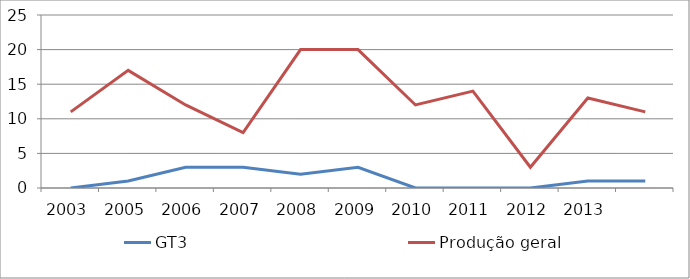
| Category | GT3 | Produção geral |
|---|---|---|
| 2003.0 | 0 | 11 |
| 2005.0 | 1 | 17 |
| 2006.0 | 3 | 12 |
| 2007.0 | 3 | 8 |
| 2008.0 | 2 | 20 |
| 2009.0 | 3 | 20 |
| 2010.0 | 0 | 12 |
| 2011.0 | 0 | 14 |
| 2012.0 | 0 | 3 |
| 2013.0 | 1 | 13 |